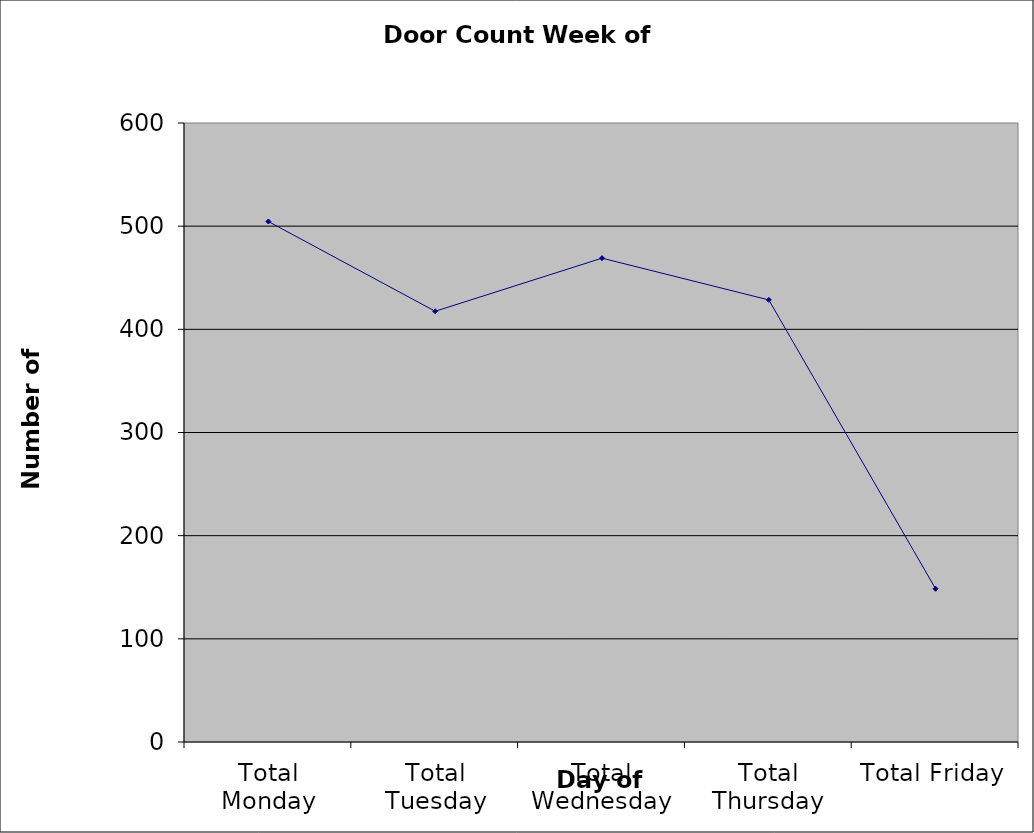
| Category | Series 0 |
|---|---|
| Total Monday | 504.5 |
| Total Tuesday | 417.5 |
| Total Wednesday | 469 |
| Total Thursday | 428.5 |
| Total Friday | 148.5 |